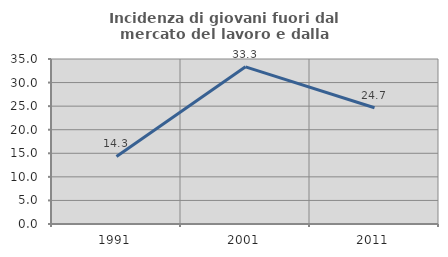
| Category | Incidenza di giovani fuori dal mercato del lavoro e dalla formazione  |
|---|---|
| 1991.0 | 14.336 |
| 2001.0 | 33.333 |
| 2011.0 | 24.67 |